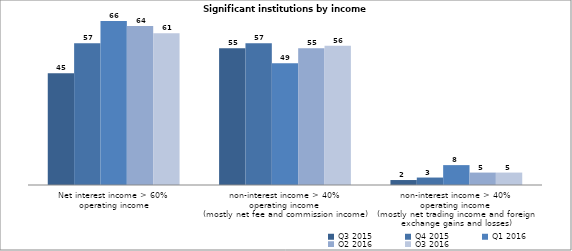
| Category | Q3 2015 | Q4 2015 | Q1 2016 | Q2 2016 | Q3 2016 |
|---|---|---|---|---|---|
| Net interest income > 60% 
operating income | 45 | 57 | 66 | 64 | 61 |
| non-interest income > 40% 
operating income 
(mostly net fee and commission income) | 55 | 57 | 49 | 55 | 56 |
| non-interest income > 40% 
operating income 
(mostly net trading income and foreign exchange gains and losses) | 2 | 3 | 8 | 5 | 5 |